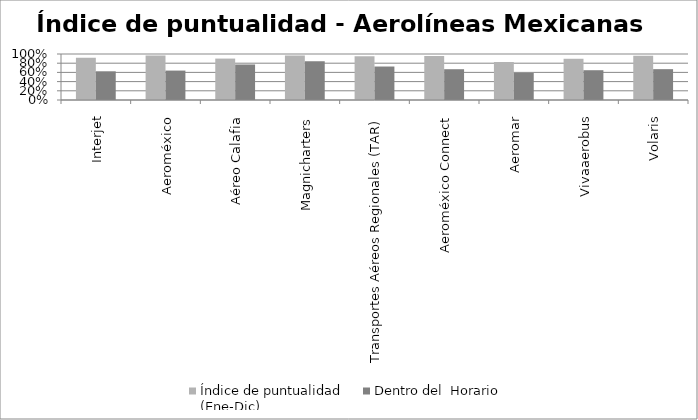
| Category | Índice de puntualidad
(Ene-Dic) | Dentro del  Horario |
|---|---|---|
| Interjet | 0.917 | 0.623 |
| Aeroméxico | 0.966 | 0.64 |
| Aéreo Calafia | 0.9 | 0.772 |
| Magnicharters | 0.966 | 0.842 |
| Transportes Aéreos Regionales (TAR) | 0.95 | 0.728 |
| Aeroméxico Connect | 0.959 | 0.669 |
| Aeromar | 0.826 | 0.589 |
| Vivaaerobus | 0.896 | 0.648 |
| Volaris | 0.964 | 0.671 |